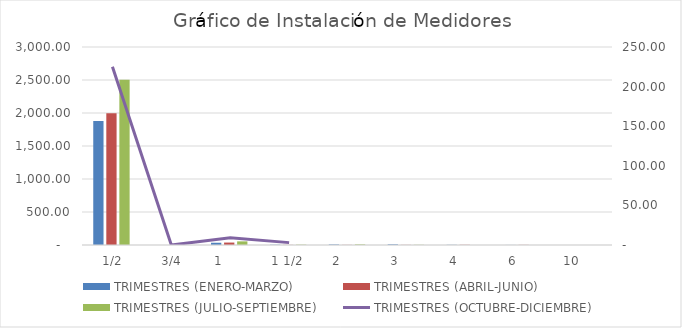
| Category | TRIMESTRES |
|---|---|
| 0.5 | 2504 |
| 0.75 | 0 |
| 1.0 | 55 |
| 1.5 | 5 |
| 2.0 | 9 |
| 3.0 | 3 |
| 4.0 | 0 |
| 6.0 | 0 |
| 10.0 | 0 |